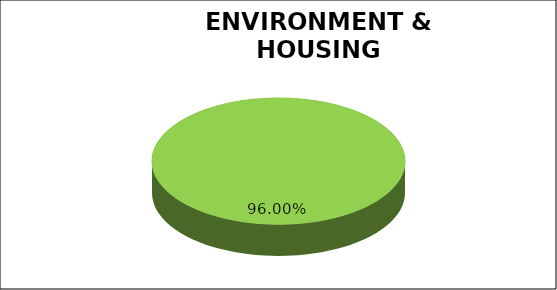
| Category | Green | Amber | Red |
|---|---|---|---|
| Q1 | 0.96 | 0.04 | 0 |